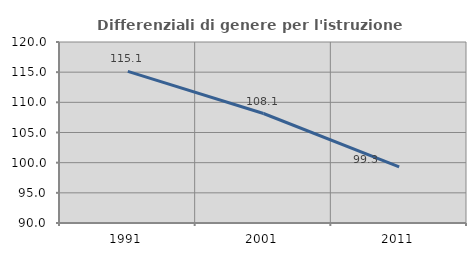
| Category | Differenziali di genere per l'istruzione superiore |
|---|---|
| 1991.0 | 115.132 |
| 2001.0 | 108.148 |
| 2011.0 | 99.312 |